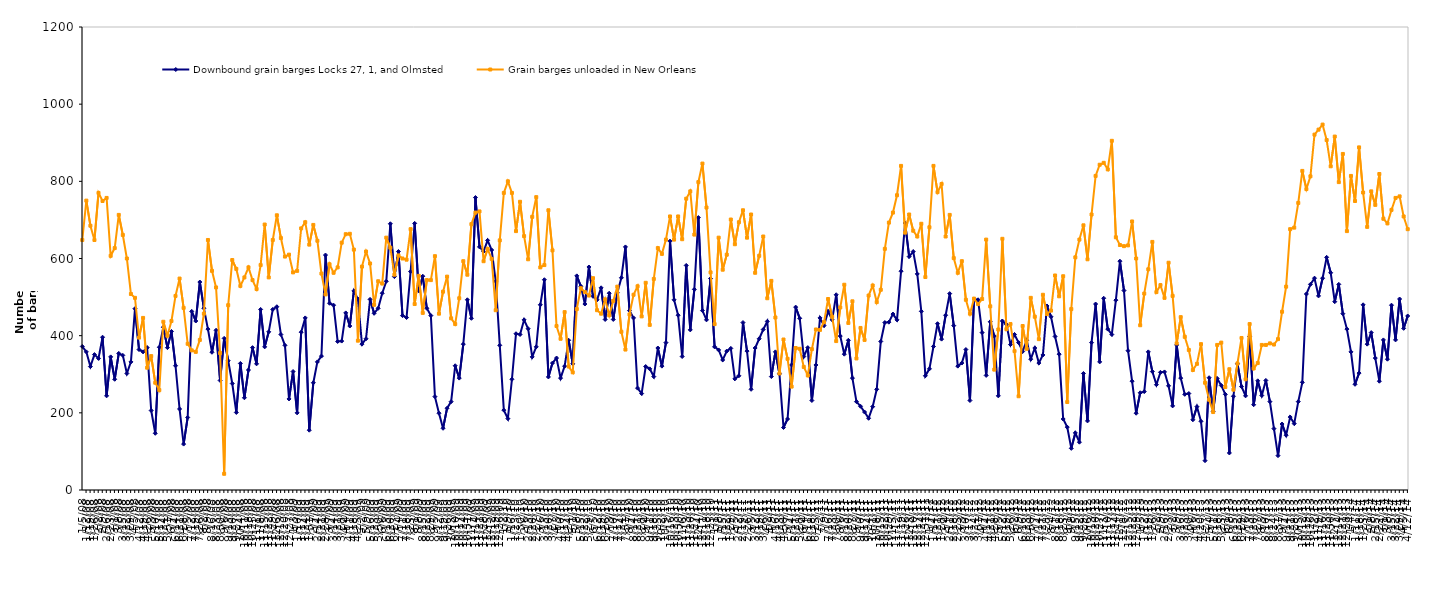
| Category | Downbound grain barges Locks 27, 1, and Olmsted | Grain barges unloaded in New Orleans  |
|---|---|---|
| 1/5/08 | 372 | 648 |
| 1/12/08 | 358 | 750 |
| 1/19/08 | 320 | 685 |
| 1/26/08 | 351 | 648 |
| 2/2/08 | 341 | 770 |
| 2/9/08 | 396 | 749 |
| 2/16/08 | 244 | 757 |
| 2/23/08 | 345 | 607 |
| 3/1/08 | 287 | 627 |
| 3/8/08 | 354 | 713 |
| 3/15/08 | 349 | 661 |
| 3/22/08 | 302 | 600 |
| 3/29/08 | 332 | 508 |
| 4/5/08 | 470 | 498 |
| 4/12/08 | 364 | 395 |
| 4/19/08 | 358 | 446 |
| 4/26/08 | 369 | 317 |
| 5/3/08 | 206 | 347 |
| 5/10/08 | 147 | 278 |
| 5/17/08 | 370 | 259 |
| 5/24/08 | 422 | 436 |
| 5/31/08 | 369 | 400 |
| 6/7/08 | 411 | 438 |
| 6/14/08 | 322 | 503 |
| 6/21/08 | 210 | 548 |
| 6/28/08 | 119 | 472 |
| 7/5/08 | 188 | 379 |
| 7/12/08 | 463 | 362 |
| 7/19/08 | 438 | 358 |
| 7/26/08 | 539 | 389 |
| 8/2/08 | 471 | 457 |
| 8/9/08 | 417 | 648 |
| 8/16/08 | 357 | 568 |
| 8/23/08 | 414 | 525 |
| 8/30/08 | 284 | 355 |
| 9/6/08 | 393 | 42 |
| 9/13/08 | 335 | 479 |
| 9/20/08 | 276 | 596 |
| 9/27/08 | 201 | 573 |
| 10/4/08 | 328 | 529 |
| 10/11/08 | 239 | 551 |
| 10/18/08 | 311 | 577 |
| 10/25/08 | 369 | 544 |
| 11/1/08 | 327 | 521 |
| 11/8/08 | 468 | 583 |
| 11/15/08 | 371 | 688 |
| 11/22/08 | 410 | 551 |
| 11/29/08 | 468 | 648 |
| 12/6/08 | 475 | 712 |
| 12/13/08 | 403 | 653 |
| 12/20/08 | 375 | 605 |
| 12/27/08 | 236 | 610 |
| 1/3/09 | 307 | 564 |
| 1/10/09 | 200 | 568 |
| 1/17/09 | 409 | 678 |
| 1/24/09 | 446 | 694 |
| 1/31/09 | 155 | 636 |
| 2/7/09 | 278 | 687 |
| 2/14/09 | 332 | 646 |
| 2/21/09 | 347 | 561 |
| 2/28/09 | 609 | 507 |
| 3/7/09 | 484 | 585 |
| 3/14/09 | 479 | 563 |
| 3/21/09 | 385 | 577 |
| 3/28/09 | 386 | 641 |
| 4/4/09 | 459 | 663 |
| 4/11/09 | 425 | 664 |
| 4/18/09 | 516 | 623 |
| 4/25/09 | 495 | 387 |
| 5/2/09 | 378 | 579 |
| 5/9/09 | 392 | 618 |
| 5/16/09 | 494 | 587 |
| 5/23/09 | 458 | 480 |
| 5/30/09 | 471 | 541 |
| 6/6/09 | 510 | 535 |
| 6/13/09 | 541 | 654 |
| 6/20/09 | 690 | 628 |
| 6/27/09 | 553 | 558 |
| 7/4/09 | 618 | 608 |
| 7/11/09 | 452 | 600 |
| 7/18/09 | 447 | 597 |
| 7/25/09 | 566 | 676 |
| 8/1/09 | 691 | 482 |
| 8/8/09 | 516 | 555 |
| 8/15/09 | 554 | 459 |
| 8/22/09 | 471 | 544 |
| 8/29/09 | 452 | 544 |
| 9/5/09 | 242 | 606 |
| 9/12/09 | 199 | 457 |
| 9/19/09 | 160 | 514 |
| 9/26/09 | 212 | 553 |
| 10/3/09 | 229 | 445 |
| 10/10/09 | 322 | 430 |
| 10/17/09 | 290 | 497 |
| 10/24/09 | 378 | 593 |
| 10/31/09 | 493 | 558 |
| 11/7/09 | 445 | 689 |
| 11/14/09 | 758 | 719 |
| 11/21/09 | 630 | 722 |
| 11/28/09 | 618 | 593 |
| 12/5/09 | 647 | 625 |
| 12/12/09 | 622 | 599 |
| 12/19/09 | 541 | 466 |
| 12/26/09 | 375 | 647 |
| 1/2/10 | 207 | 770 |
| 1/9/10 | 185 | 800 |
| 1/16/10 | 287 | 770 |
| 1/23/10 | 405 | 671 |
| 1/30/10 | 403 | 747 |
| 2/6/10 | 441 | 658 |
| 2/13/10 | 418 | 598 |
| 2/20/10 | 345 | 708 |
| 2/27/10 | 371 | 759 |
| 3/6/10 | 480 | 577 |
| 3/13/10 | 545 | 583 |
| 3/20/10 | 293 | 725 |
| 3/27/10 | 329 | 621 |
| 4/3/10 | 342 | 425 |
| 4/10/10 | 290 | 392 |
| 4/17/10 | 321 | 461 |
| 4/24/10 | 388 | 320 |
| 5/1/10 | 327 | 305 |
| 5/8/10 | 555 | 469 |
| 5/15/10 | 528 | 523 |
| 5/22/10 | 482 | 513 |
| 5/29/10 | 578 | 504 |
| 6/5/10 | 502 | 549 |
| 6/12/10 | 493 | 466 |
| 6/19/10 | 524 | 457 |
| 6/26/10 | 442 | 494 |
| 7/3/10 | 510 | 453 |
| 7/10/10 | 442 | 490 |
| 7/17/10 | 511 | 527 |
| 7/24/10 | 550 | 410 |
| 7/31/10 | 630 | 364 |
| 8/7/10 | 465 | 455 |
| 8/14/10 | 446 | 506 |
| 8/21/10 | 264 | 528 |
| 8/28/10 | 250 | 450 |
| 9/4/10 | 320 | 537 |
| 9/11/10 | 314 | 428 |
| 9/18/10 | 294 | 547 |
| 9/25/10 | 368 | 627 |
| 10/2/10 | 321 | 612 |
| 10/9/10 | 382 | 649 |
| 10/16/10 | 645 | 709 |
| 10/23/10 | 493 | 649 |
| 10/30/10 | 453 | 709 |
| 11/6/10 | 346 | 650 |
| 11/13/10 | 582 | 755 |
| 11/20/10 | 415 | 774 |
| 11/27/10 | 520 | 662 |
| 12/4/10 | 706 | 798 |
| 12/11/10 | 465 | 846 |
| 12/18/10 | 441 | 732 |
| 12/25/10 | 548 | 564 |
| 1/1/11 | 371 | 430 |
| 1/8/11 | 363 | 654 |
| 1/15/11 | 337 | 571 |
| 1/22/11 | 360 | 610 |
| 1/29/11 | 367 | 701 |
| 2/5/11 | 288 | 637 |
| 2/12/11 | 296 | 694 |
| 2/19/11 | 434 | 725 |
| 2/26/11 | 360 | 654 |
| 3/5/11 | 261 | 714 |
| 3/12/11 | 368 | 563 |
| 3/19/11 | 392 | 607 |
| 3/26/11 | 416 | 657 |
| 4/2/11 | 437 | 497 |
| 4/9/11 | 294 | 542 |
| 4/16/11 | 358 | 447 |
| 4/23/11 | 301 | 302 |
| 4/30/11 | 162 | 390 |
| 5/7/11 | 184 | 340 |
| 5/14/11 | 324 | 268 |
| 5/21/11 | 474 | 368 |
| 5/28/11 | 445 | 366 |
| 6/4/11 | 346 | 319 |
| 6/11/11 | 369 | 297 |
| 6/18/11 | 232 | 365 |
| 6/25/11 | 324 | 416 |
| 7/2/11 | 446 | 415 |
| 7/9/11 | 426 | 435 |
| 7/16/11 | 463 | 495 |
| 7/23/11 | 441 | 449 |
| 7/30/11 | 506 | 386 |
| 8/6/11 | 399 | 473 |
| 8/13/11 | 352 | 532 |
| 8/20/11 | 388 | 433 |
| 8/27/11 | 290 | 489 |
| 9/3/11 | 229 | 341 |
| 9/10/11 | 217 | 420 |
| 9/17/11 | 202 | 389 |
| 9/24/11 | 186 | 504 |
| 10/1/11 | 216 | 530 |
| 10/8/11 | 261 | 487 |
| 10/15/11 | 385 | 519 |
| 10/22/11 | 434 | 625 |
| 10/29/11 | 435 | 693 |
| 11/5/11 | 456 | 719 |
| 11/12/11 | 441 | 764 |
| 11/19/11 | 567 | 840 |
| 11/26/11 | 692 | 667 |
| 12/3/11 | 605 | 714 |
| 12/10/11 | 618 | 672 |
| 12/17/11 | 560 | 657 |
| 12/24/11 | 463 | 690 |
| 12/31/11 | 296 | 552 |
| 1/7/12 | 314 | 681 |
| 1/14/12 | 372 | 840 |
| 1/21/12 | 431 | 772 |
| 1/28/12 | 391 | 793 |
| 2/4/12 | 453 | 657 |
| 2/11/12 | 509 | 713 |
| 2/18/12 | 426 | 601 |
| 2/25/12 | 321 | 563 |
| 3/3/12 | 329 | 593 |
| 3/10/12 | 364 | 493 |
| 3/17/12 | 232 | 457 |
| 3/24/12 | 495 | 496 |
| 3/31/12 | 493 | 482 |
| 4/7/12 | 408 | 495 |
| 4/14/12 | 297 | 649 |
| 4/21/12 | 436 | 476 |
| 4/28/12 | 399 | 312 |
| 5/5/12 | 244 | 416 |
| 5/12/12 | 438 | 651 |
| 5/19/12 | 429 | 417 |
| 5/26/12 | 377 | 430 |
| 6/2/12 | 403 | 360 |
| 6/9/12 | 382 | 243 |
| 6/16/12 | 359 | 425 |
| 6/23/12 | 388 | 366 |
| 6/30/12 | 339 | 498 |
| 7/7/12 | 368 | 449 |
| 7/14/12 | 329 | 391 |
| 7/21/12 | 350 | 506 |
| 7/28/12 | 477 | 456 |
| 8/4/12 | 449 | 465 |
| 8/11/12 | 398 | 556 |
| 8/18/12 | 352 | 502 |
| 8/25/12 | 184 | 554 |
| 9/1/12 | 163 | 228 |
| 9/8/12 | 108 | 469 |
| 9/15/12 | 148 | 603 |
| 9/22/12 | 124 | 649 |
| 9/29/12 | 302 | 686 |
| 10/6/12 | 179 | 598 |
| 10/13/12 | 382 | 714 |
| 10/20/12 | 482 | 814 |
| 10/27/12 | 332 | 843 |
| 11/3/12 | 497 | 848 |
| 11/10/12 | 417 | 831 |
| 11/17/12 | 403 | 905 |
| 11/24/12 | 492 | 655 |
| 12/1/12 | 593 | 635 |
| 12/8/12 | 517 | 632 |
| 12/15/12 | 361 | 634 |
| 12/22/12 | 282 | 696 |
| 12/29/12 | 199 | 600 |
| 1/5/13 | 252 | 427 |
| 1/12/13 | 255 | 509 |
| 1/19/13 | 358 | 572 |
| 1/26/13 | 307 | 643 |
| 2/2/13 | 273 | 513 |
| 2/9/13 | 305 | 531 |
| 2/16/13 | 306 | 498 |
| 2/23/13 | 270 | 589 |
| 3/2/13 | 218 | 503 |
| 3/9/13 | 376 | 380 |
| 3/16/13 | 290 | 448 |
| 3/23/13 | 248 | 397 |
| 3/30/13 | 250 | 363 |
| 4/6/13 | 182 | 311 |
| 4/13/13 | 216 | 327 |
| 4/20/13 | 178 | 378 |
| 4/27/13 | 76 | 278 |
| 5/4/13 | 291 | 234 |
| 5/11/13 | 204 | 202 |
| 5/18/13 | 289 | 376 |
| 5/25/13 | 271 | 382 |
| 6/1/13 | 248 | 267 |
| 6/8/13 | 96 | 313 |
| 6/15/13 | 243 | 260 |
| 6/22/13 | 327 | 328 |
| 6/29/13 | 268 | 394 |
| 7/6/13 | 244 | 287 |
| 7/13/13 | 398 | 430 |
| 7/20/13 | 221 | 315 |
| 7/27/13 | 283 | 329 |
| 8/3/13 | 245 | 376 |
| 8/10/13 | 284 | 376 |
| 8/17/13 | 229 | 380 |
| 8/24/13 | 159 | 377 |
| 8/31/13 | 89 | 391 |
| 9/7/13 | 171 | 462 |
| 9/14/13 | 142 | 527 |
| 9/21/13 | 189 | 676 |
| 9/28/13 | 172 | 680 |
| 10/5/13 | 229 | 744 |
| 10/12/13 | 279 | 827 |
| 10/19/13 | 508 | 780 |
| 10/26/13 | 533 | 813 |
| 11/2/13 | 549 | 921 |
| 11/9/13 | 503 | 934 |
| 11/16/13 | 549 | 947 |
| 11/23/13 | 603 | 907 |
| 11/30/13 | 563 | 839 |
| 12/7/13 | 488 | 916 |
| 12/14/13 | 533 | 798 |
| 12/21/13 | 457 | 871 |
| 12/28/13 | 417 | 671 |
| 1/4/14 | 358 | 814 |
| 1/11/14 | 274 | 749 |
| 1/18/14 | 303 | 888 |
| 1/25/14 | 480 | 771 |
| 2/1/14 | 378 | 682 |
| 2/8/14 | 408 | 774 |
| 2/15/14 | 342 | 739 |
| 2/22/14 | 282 | 819 |
| 3/1/14 | 389 | 703 |
| 3/8/14 | 339 | 691 |
| 3/15/14 | 479 | 726 |
| 3/22/14 | 389 | 757 |
| 3/29/14 | 495 | 761 |
| 4/5/14 | 419 | 709 |
| 4/12/14 | 451 | 676 |